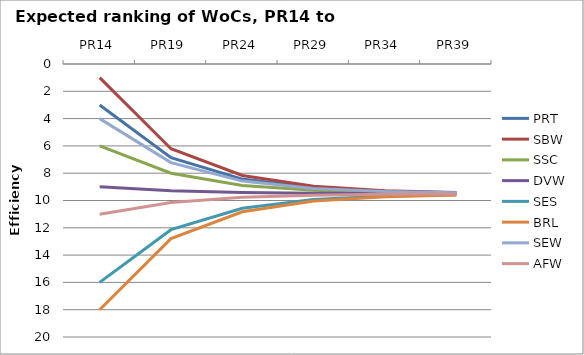
| Category | PRT | SBW | SSC | DVW | SES | BRL | SEW | AFW |
|---|---|---|---|---|---|---|---|---|
| PR14 | 3 | 1 | 6 | 9 | 16 | 18 | 4 | 11 |
| PR19 | 6.863 | 6.21 | 8.005 | 9.282 | 12.137 | 12.79 | 7.223 | 10.153 |
| PR24 | 8.433 | 8.171 | 8.894 | 9.411 | 10.567 | 10.829 | 8.578 | 9.765 |
| PR29 | 9.068 | 8.962 | 9.255 | 9.464 | 9.932 | 10.038 | 9.127 | 9.607 |
| PR34 | 9.325 | 9.282 | 9.401 | 9.485 | 9.675 | 9.718 | 9.349 | 9.543 |
| PR39 | 9.429 | 9.412 | 9.46 | 9.494 | 9.571 | 9.588 | 9.439 | 9.518 |